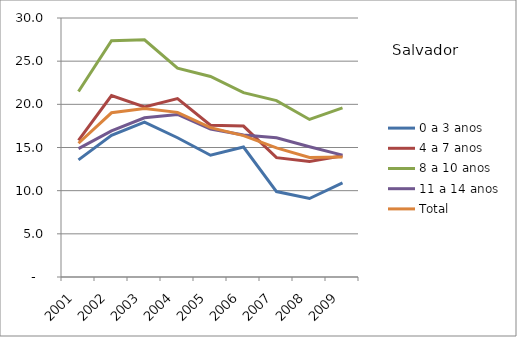
| Category | 0 a 3 anos | 4 a 7 anos | 8 a 10 anos | 11 a 14 anos | Total |
|---|---|---|---|---|---|
| 2001.0 | 13.57 | 15.83 | 21.49 | 14.87 | 15.49 |
| 2002.0 | 16.42 | 21.01 | 27.36 | 16.93 | 19.02 |
| 2003.0 | 17.94 | 19.7 | 27.47 | 18.44 | 19.53 |
| 2004.0 | 16.13 | 20.67 | 24.18 | 18.83 | 19.07 |
| 2005.0 | 14.1 | 17.58 | 23.23 | 17.14 | 17.3 |
| 2006.0 | 15.05 | 17.48 | 21.35 | 16.46 | 16.38 |
| 2007.0 | 9.9 | 13.82 | 20.43 | 16.12 | 14.96 |
| 2008.0 | 9.09 | 13.38 | 18.25 | 15.09 | 13.84 |
| 2009.0 | 10.9 | 14.05 | 19.59 | 14.12 | 13.9 |